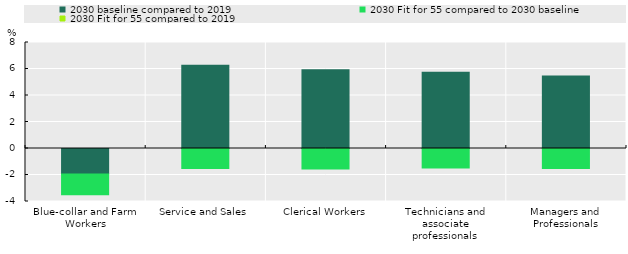
| Category | 2030 baseline compared to 2019 | 2030 Fit for 55 compared to 2030 baseline |
|---|---|---|
| Blue-collar and Farm Workers | -1.93 | -1.555 |
| Service and Sales | 6.29 | -1.505 |
| Clerical Workers | 5.939 | -1.543 |
| Technicians and associate professionals | 5.759 | -1.478 |
| Managers and Professionals | 5.465 | -1.501 |